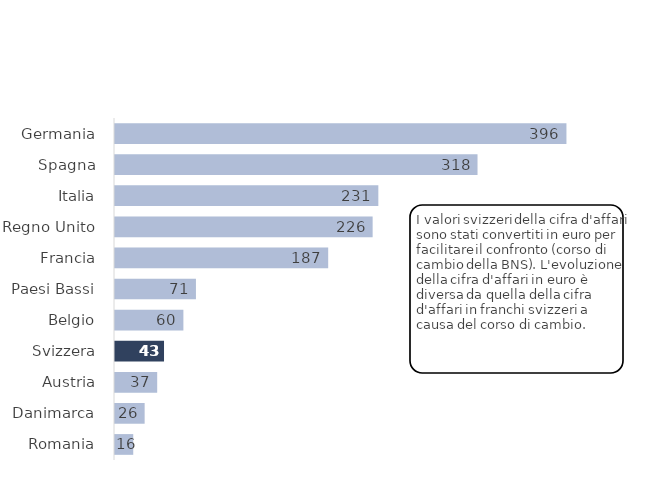
| Category | 2020 |
|---|---|
| Romania | 16 |
| Danimarca | 26 |
| Austria | 37 |
| Svizzera | 43 |
| Belgio | 60 |
| Paesi Bassi | 71 |
| Francia | 187 |
| Regno Unito | 226 |
| Italia | 231 |
| Spagna | 318 |
| Germania | 396 |